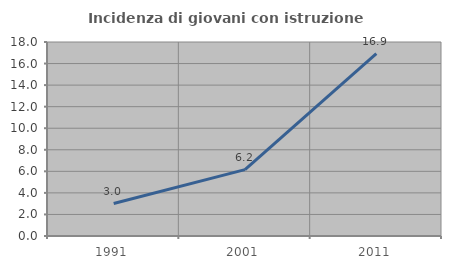
| Category | Incidenza di giovani con istruzione universitaria |
|---|---|
| 1991.0 | 3.012 |
| 2001.0 | 6.161 |
| 2011.0 | 16.923 |